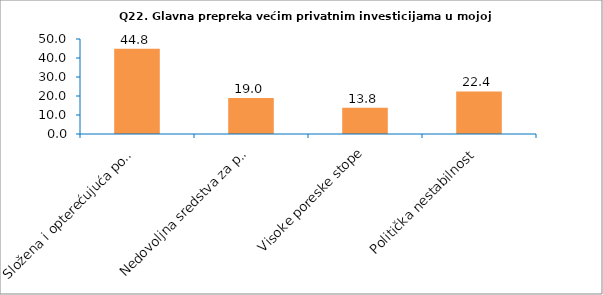
| Category | Series 0 |
|---|---|
| Složena i opterećujuća poslovna regulativa | 44.828 |
| Nedovoljna sredstva za promociju/podsticanje investicija | 18.966 |
| Visoke poreske stope | 13.793 |
| Politička nestabilnost | 22.414 |